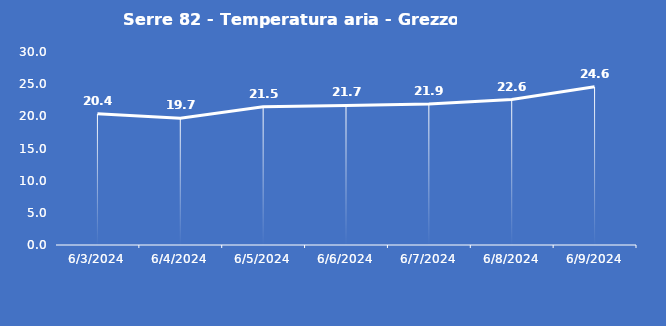
| Category | Serre 82 - Temperatura aria - Grezzo (°C) |
|---|---|
| 6/3/24 | 20.4 |
| 6/4/24 | 19.7 |
| 6/5/24 | 21.5 |
| 6/6/24 | 21.7 |
| 6/7/24 | 21.9 |
| 6/8/24 | 22.6 |
| 6/9/24 | 24.6 |